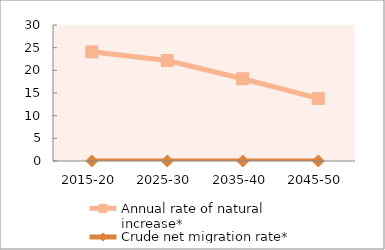
| Category | Annual rate of natural increase* | Crude net migration rate* |
|---|---|---|
| 2015-20 | 24.078 | 0 |
| 2025-30 | 22.155 | 0 |
| 2035-40 | 18.146 | 0 |
| 2045-50 | 13.801 | 0 |